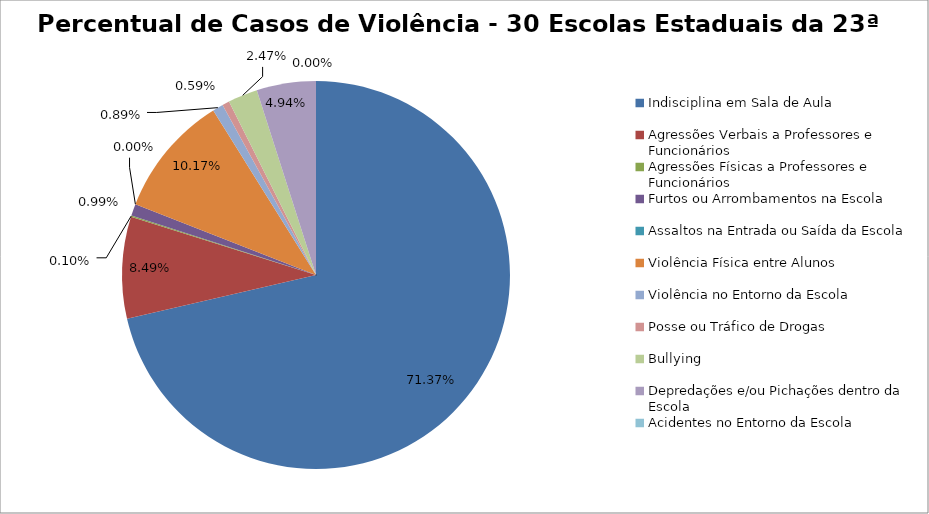
| Category | Percentual |
|---|---|
| Indisciplina em Sala de Aula | 0.714 |
| Agressões Verbais a Professores e Funcionários | 0.085 |
| Agressões Físicas a Professores e Funcionários | 0.001 |
| Furtos ou Arrombamentos na Escola | 0.01 |
| Assaltos na Entrada ou Saída da Escola | 0 |
| Violência Física entre Alunos | 0.102 |
| Violência no Entorno da Escola | 0.009 |
| Posse ou Tráfico de Drogas | 0.006 |
| Bullying | 0.025 |
| Depredações e/ou Pichações dentro da Escola | 0.049 |
| Acidentes no Entorno da Escola | 0 |